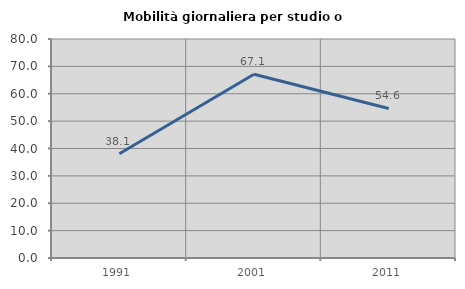
| Category | Mobilità giornaliera per studio o lavoro |
|---|---|
| 1991.0 | 38.065 |
| 2001.0 | 67.136 |
| 2011.0 | 54.63 |